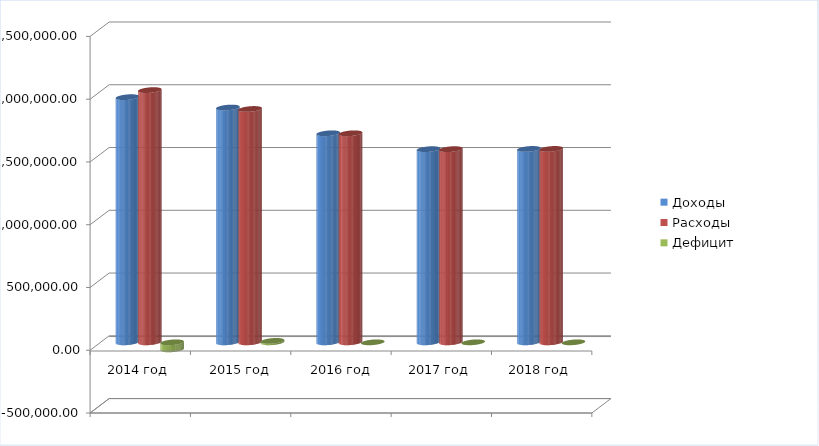
| Category | Доходы | Расходы | Дефицит |
|---|---|---|---|
| 2014 год | 1953069.45 | 2009357.97 | -56288.52 |
|  2015 год | 1870579.58 | 1859011.8 | 11567.78 |
|  2016 год | 1665279.1 | 1665279.1 | 0 |
| 2017 год | 1538986.9 | 1538986.9 | 0 |
| 2018 год | 1540761.5 | 1540761.5 | 0 |